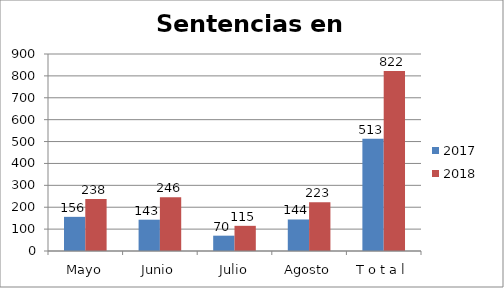
| Category | 2017 | 2018 |
|---|---|---|
| Mayo | 156 | 238 |
| Junio | 143 | 246 |
| Julio | 70 | 115 |
| Agosto | 144 | 223 |
| T o t a l | 513 | 822 |